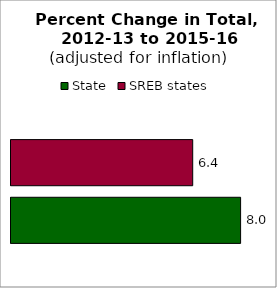
| Category | State | SREB states |
|---|---|---|
| 0 | 8.041 | 6.363 |